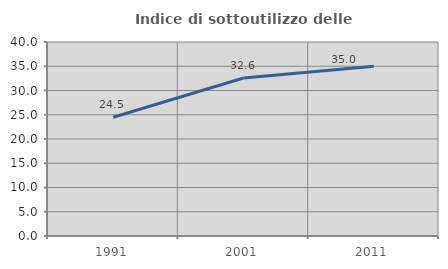
| Category | Indice di sottoutilizzo delle abitazioni  |
|---|---|
| 1991.0 | 24.48 |
| 2001.0 | 32.568 |
| 2011.0 | 34.984 |